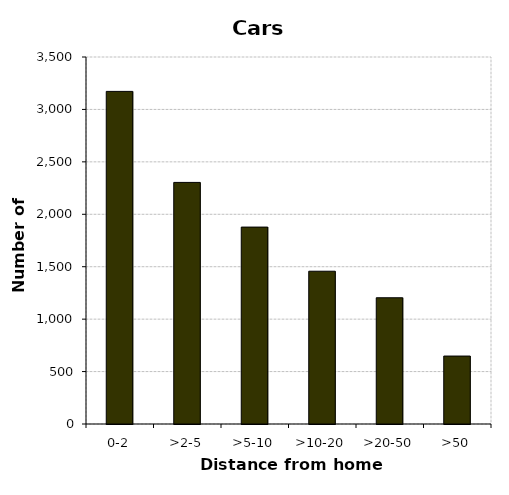
| Category | Cars |
|---|---|
| 0-2 | 3172 |
| >2-5 | 2304 |
| >5-10 | 1878 |
| >10-20 | 1457 |
| >20-50 | 1204 |
| >50 | 648 |